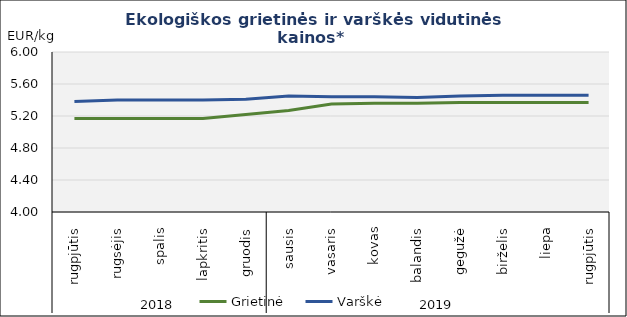
| Category | Grietinė | Varškė |
|---|---|---|
| 0 | 5.17 | 5.38 |
| 1 | 5.17 | 5.4 |
| 2 | 5.17 | 5.4 |
| 3 | 5.17 | 5.4 |
| 4 | 5.22 | 5.41 |
| 5 | 5.27 | 5.45 |
| 6 | 5.35 | 5.44 |
| 7 | 5.36 | 5.44 |
| 8 | 5.36 | 5.43 |
| 9 | 5.37 | 5.45 |
| 10 | 5.37 | 5.46 |
| 11 | 5.37 | 5.46 |
| 12 | 5.37 | 5.46 |